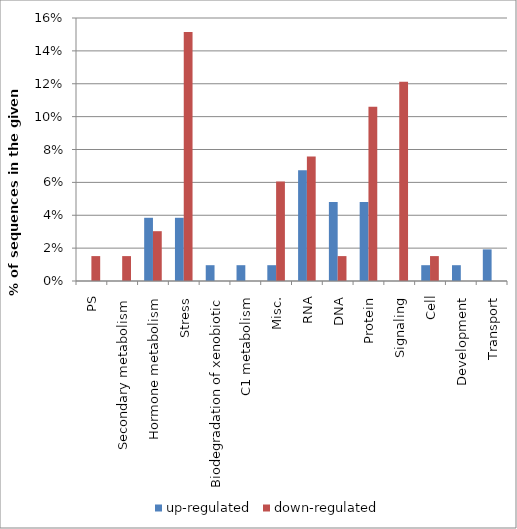
| Category | up-regulated | down-regulated |
|---|---|---|
| PS | 0 | 0.015 |
| Secondary metabolism | 0 | 0.015 |
| Hormone metabolism | 0.038 | 0.03 |
| Stress | 0.038 | 0.152 |
| Biodegradation of xenobiotic | 0.01 | 0 |
| C1 metabolism | 0.01 | 0 |
| Misc. | 0.01 | 0.061 |
| RNA | 0.067 | 0.076 |
| DNA | 0.048 | 0.015 |
| Protein | 0.048 | 0.106 |
| Signaling | 0 | 0.121 |
| Cell | 0.01 | 0.015 |
| Development | 0.01 | 0 |
| Transport | 0.019 | 0 |